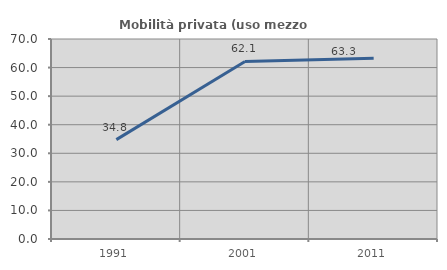
| Category | Mobilità privata (uso mezzo privato) |
|---|---|
| 1991.0 | 34.775 |
| 2001.0 | 62.138 |
| 2011.0 | 63.257 |